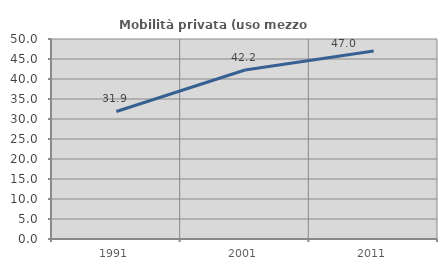
| Category | Mobilità privata (uso mezzo privato) |
|---|---|
| 1991.0 | 31.885 |
| 2001.0 | 42.243 |
| 2011.0 | 47.021 |